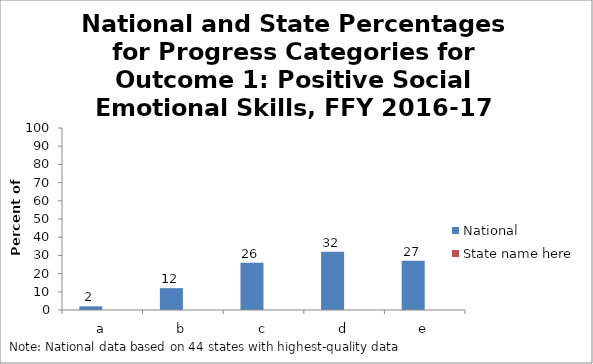
| Category | National | State name here |
|---|---|---|
| a | 2 |  |
| b | 12 |  |
| c | 26 |  |
| d | 32 |  |
| e | 27 |  |